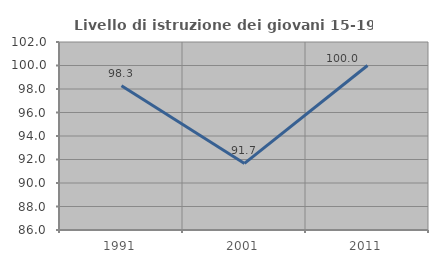
| Category | Livello di istruzione dei giovani 15-19 anni |
|---|---|
| 1991.0 | 98.276 |
| 2001.0 | 91.667 |
| 2011.0 | 100 |